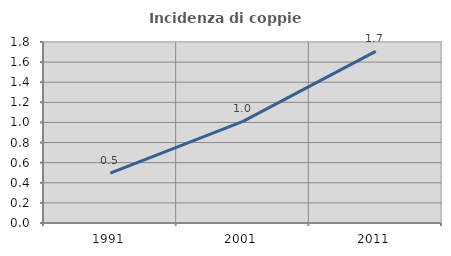
| Category | Incidenza di coppie miste |
|---|---|
| 1991.0 | 0.495 |
| 2001.0 | 1.01 |
| 2011.0 | 1.707 |